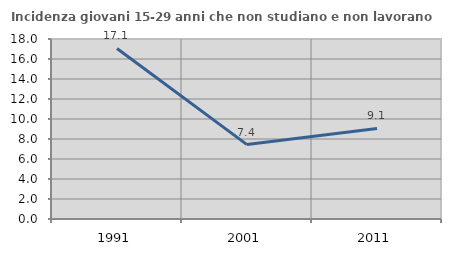
| Category | Incidenza giovani 15-29 anni che non studiano e non lavorano  |
|---|---|
| 1991.0 | 17.053 |
| 2001.0 | 7.439 |
| 2011.0 | 9.051 |